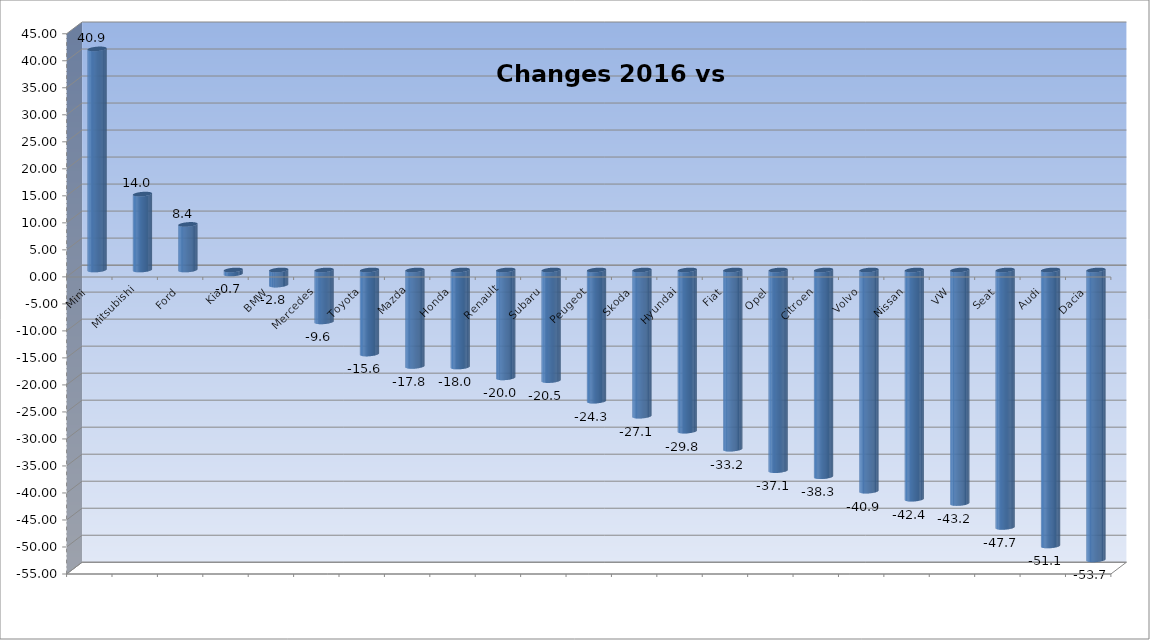
| Category | Ytd 2015 |
|---|---|
| Mini | 40.925 |
| Mitsubishi | 14.05 |
| Ford | 8.439 |
| Kia | -0.744 |
| BMW | -2.795 |
| Mercedes | -9.602 |
| Toyota | -15.556 |
| Mazda | -17.843 |
| Honda | -17.958 |
| Renault | -19.964 |
| Subaru | -20.474 |
| Peugeot | -24.28 |
| Skoda | -27.058 |
| Hyundai | -29.829 |
| Fiat | -33.165 |
| Opel | -37.143 |
| Citroen | -38.265 |
| Volvo | -40.943 |
| Nissan | -42.424 |
| VW | -43.226 |
| Seat | -47.652 |
| Audi | -51.081 |
| Dacia | -53.659 |